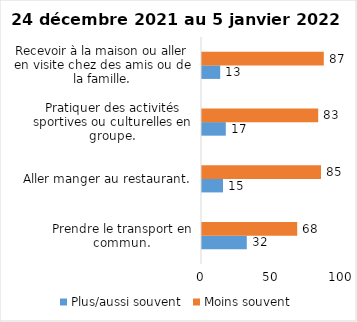
| Category | Plus/aussi souvent | Moins souvent |
|---|---|---|
| Prendre le transport en commun. | 32 | 68 |
| Aller manger au restaurant. | 15 | 85 |
| Pratiquer des activités sportives ou culturelles en groupe. | 17 | 83 |
| Recevoir à la maison ou aller en visite chez des amis ou de la famille. | 13 | 87 |